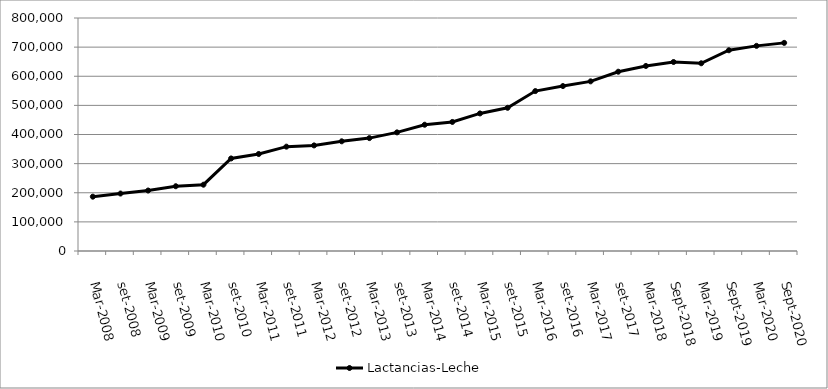
| Category | Lactancias-Leche  |
|---|---|
| mar-2008 | 186528 |
| set-2008 | 197292 |
| mar-2009 | 207648 |
| set-2009 | 222353 |
| mar-2010 | 227619 |
| set-2010 | 317718 |
| mar-2011 | 333095 |
| set-2011 | 358254 |
| mar-2012 | 362509 |
| set-2012 | 376620 |
| mar-2013 | 387638 |
| set-2013 | 407294 |
| mar-2014 | 433571 |
| set-2014 | 443114 |
| mar-2015 | 472333 |
| set-2015 | 491728 |
| mar-2016 | 549068 |
| set-2016 | 566338 |
| mar-2017 | 582470 |
| set-2017 | 615581 |
| mar-2018 | 635290 |
| sep-2018 | 648922 |
| mar-2019 | 644563 |
| sep-2019 | 689229 |
| mar-2020 | 704319 |
| sep-2020 | 714593 |